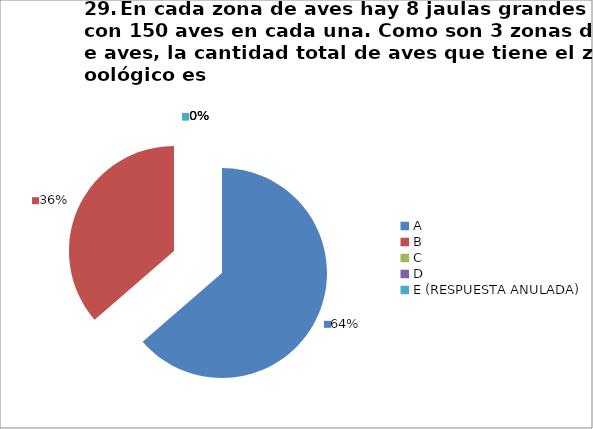
| Category | CANTIDAD DE RESPUESTAS PREGUNTA (29) | PORCENTAJE |
|---|---|---|
| A | 14 | 0.636 |
| B | 8 | 0.364 |
| C | 0 | 0 |
| D | 0 | 0 |
| E (RESPUESTA ANULADA) | 0 | 0 |